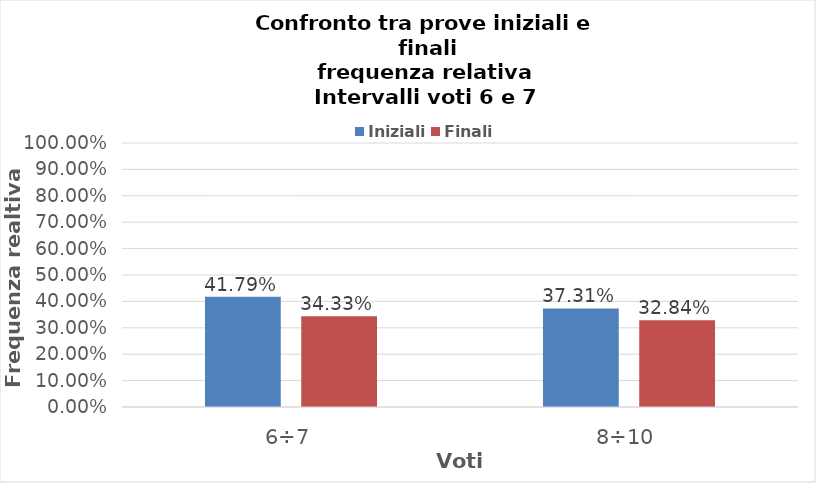
| Category | Iniziali | Finali |
|---|---|---|
| 6÷7 | 0.418 | 0.343 |
| 8÷10 | 0.373 | 0.328 |